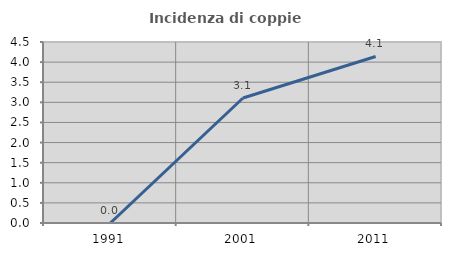
| Category | Incidenza di coppie miste |
|---|---|
| 1991.0 | 0 |
| 2001.0 | 3.107 |
| 2011.0 | 4.14 |